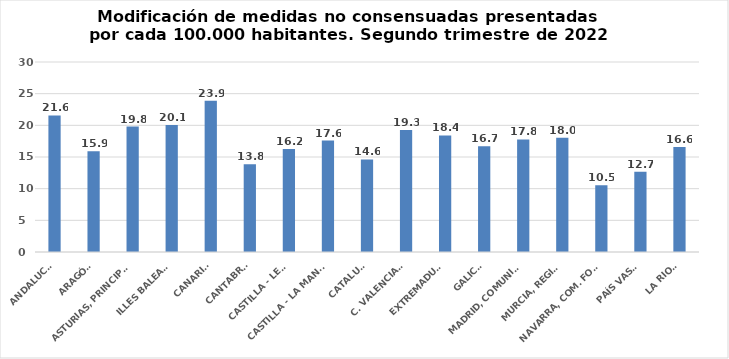
| Category | Series 0 |
|---|---|
| ANDALUCÍA | 21.566 |
| ARAGÓN | 15.92 |
| ASTURIAS, PRINCIPADO | 19.811 |
| ILLES BALEARS | 20.064 |
| CANARIAS | 23.893 |
| CANTABRIA | 13.841 |
| CASTILLA - LEÓN | 16.244 |
| CASTILLA - LA MANCHA | 17.591 |
| CATALUÑA | 14.608 |
| C. VALENCIANA | 19.27 |
| EXTREMADURA | 18.402 |
| GALICIA | 16.697 |
| MADRID, COMUNIDAD | 17.778 |
| MURCIA, REGIÓN | 18.022 |
| NAVARRA, COM. FORAL | 10.548 |
| PAÍS VASCO | 12.686 |
| LA RIOJA | 16.589 |